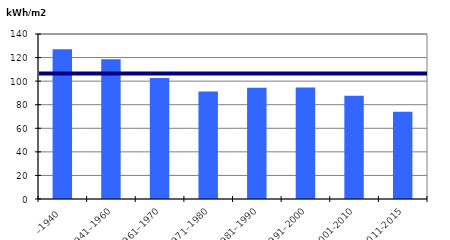
| Category | Byggårskategori |
|---|---|
| –1940 | 127.049 |
| 1941–1960 | 118.646 |
| 1961–1970 | 102.598 |
| 1971–1980 | 91.161 |
| 1981–1990 | 94.442 |
| 1991–2000 | 94.582 |
| 2001-2010 | 87.657 |
| 2011-2015 | 74.069 |